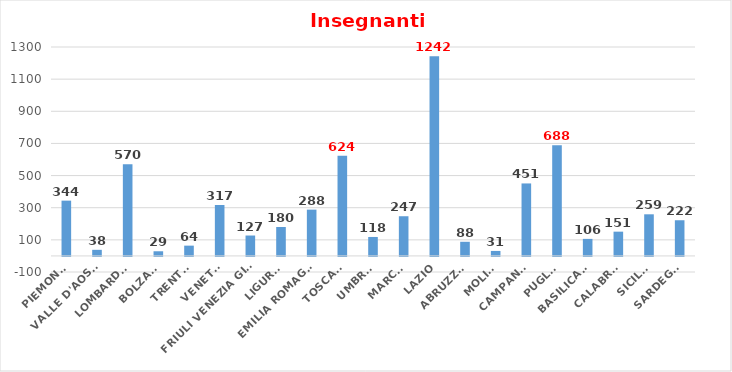
| Category | Series 0 |
|---|---|
| PIEMONTE | 344 |
| VALLE D'AOSTA | 38 |
| LOMBARDIA | 570 |
| BOLZANO | 29 |
| TRENTO | 64 |
| VENETO | 317 |
| FRIULI VENEZIA GIULIA | 127 |
| LIGURIA | 180 |
| EMILIA ROMAGNA | 288 |
| TOSCANA | 624 |
| UMBRIA | 118 |
| MARCHE | 247 |
| LAZIO | 1242 |
| ABRUZZO | 88 |
| MOLISE | 31 |
| CAMPANIA | 451 |
| PUGLIA | 688 |
| BASILICATA | 106 |
| CALABRIA | 151 |
| SICILIA | 259 |
| SARDEGNA | 222 |